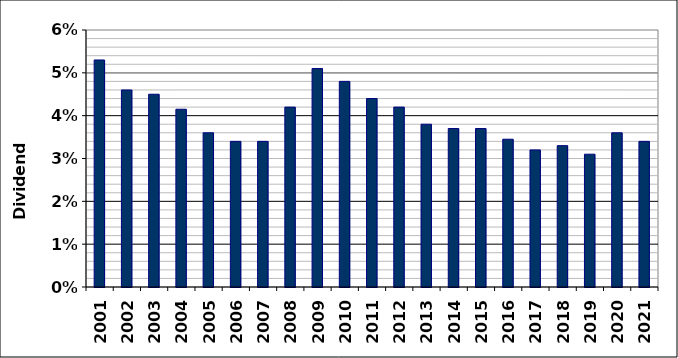
| Category | Series 0 |
|---|---|
| 2001.0 | 0.053 |
| 2002.0 | 0.046 |
| 2003.0 | 0.045 |
| 2004.0 | 0.042 |
| 2005.0 | 0.036 |
| 2006.0 | 0.034 |
| 2007.0 | 0.034 |
| 2008.0 | 0.042 |
| 2009.0 | 0.051 |
| 2010.0 | 0.048 |
| 2011.0 | 0.044 |
| 2012.0 | 0.042 |
| 2013.0 | 0.038 |
| 2014.0 | 0.037 |
| 2015.0 | 0.037 |
| 2016.0 | 0.034 |
| 2017.0 | 0.032 |
| 2018.0 | 0.033 |
| 2019.0 | 0.031 |
| 2020.0 | 0.036 |
| 2021.0 | 0.034 |